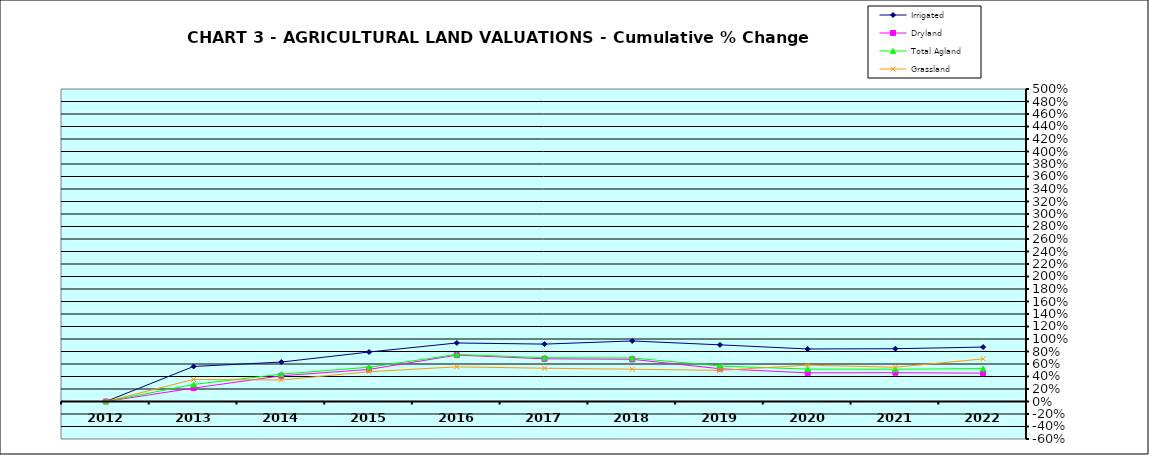
| Category | Irrigated | Dryland | Total Agland | Grassland |
|---|---|---|---|---|
| 2012.0 | 0 | 0 | 0 | 0 |
| 2013.0 | 0.561 | 0.214 | 0.272 | 0.352 |
| 2014.0 | 0.631 | 0.411 | 0.437 | 0.344 |
| 2015.0 | 0.792 | 0.513 | 0.549 | 0.476 |
| 2016.0 | 0.936 | 0.742 | 0.753 | 0.555 |
| 2017.0 | 0.918 | 0.683 | 0.701 | 0.532 |
| 2018.0 | 0.969 | 0.675 | 0.696 | 0.516 |
| 2019.0 | 0.906 | 0.524 | 0.567 | 0.498 |
| 2020.0 | 0.841 | 0.458 | 0.518 | 0.581 |
| 2021.0 | 0.845 | 0.461 | 0.516 | 0.548 |
| 2022.0 | 0.871 | 0.454 | 0.526 | 0.682 |